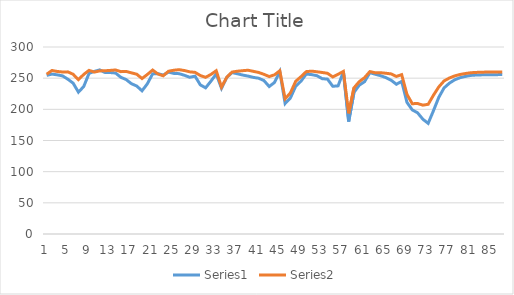
| Category | Series 0 | Series 1 |
|---|---|---|
| 0 | 254.388 | 256.287 |
| 1 | 256.547 | 262.354 |
| 2 | 255.305 | 260.738 |
| 3 | 253.683 | 259.913 |
| 4 | 248.319 | 260.099 |
| 5 | 241.928 | 256.27 |
| 6 | 227.558 | 247.604 |
| 7 | 236.64 | 256.04 |
| 8 | 257.634 | 262.539 |
| 9 | 260.844 | 259.73 |
| 10 | 263.26 | 261.628 |
| 11 | 259.128 | 261.927 |
| 12 | 259.004 | 262.435 |
| 13 | 258.248 | 263.155 |
| 14 | 251.378 | 260.464 |
| 15 | 247.765 | 260.831 |
| 16 | 241.14 | 258.521 |
| 17 | 237.375 | 256.343 |
| 18 | 229.687 | 249.419 |
| 19 | 240.945 | 255.92 |
| 20 | 256.891 | 263.012 |
| 21 | 257.277 | 256.726 |
| 22 | 254.955 | 253.867 |
| 23 | 259.754 | 261.113 |
| 24 | 257.632 | 262.733 |
| 25 | 257.225 | 263.6 |
| 26 | 254.613 | 262.261 |
| 27 | 251.411 | 260.141 |
| 28 | 253.24 | 259.314 |
| 29 | 239.235 | 254.239 |
| 30 | 234.497 | 251.342 |
| 31 | 245.112 | 255.95 |
| 32 | 256.762 | 261.92 |
| 33 | 233.683 | 235.691 |
| 34 | 251.334 | 251.511 |
| 35 | 258.934 | 259.831 |
| 36 | 257.062 | 261.124 |
| 37 | 254.99 | 262.026 |
| 38 | 253.36 | 262.726 |
| 39 | 251.278 | 260.961 |
| 40 | 249.918 | 259.19 |
| 41 | 246.213 | 256.174 |
| 42 | 236.586 | 252.598 |
| 43 | 243.113 | 255.331 |
| 44 | 260.639 | 261.904 |
| 45 | 209.31 | 216.856 |
| 46 | 218.199 | 226.313 |
| 47 | 237.016 | 244.961 |
| 48 | 245.211 | 252.444 |
| 49 | 256.589 | 260.51 |
| 50 | 255.709 | 261.273 |
| 51 | 253.996 | 260.246 |
| 52 | 249.204 | 259.131 |
| 53 | 248.473 | 257.819 |
| 54 | 236.977 | 251.976 |
| 55 | 237.661 | 256.253 |
| 56 | 260.348 | 260.85 |
| 57 | 180.469 | 193.574 |
| 58 | 227.171 | 234.511 |
| 59 | 238.766 | 244.486 |
| 60 | 244.449 | 250.885 |
| 61 | 258.777 | 260.61 |
| 62 | 256.328 | 258.622 |
| 63 | 253.971 | 258.774 |
| 64 | 251.003 | 257.901 |
| 65 | 246.776 | 256.836 |
| 66 | 240.244 | 252.769 |
| 67 | 244.823 | 255.598 |
| 68 | 211.178 | 223.919 |
| 69 | 199.111 | 209.038 |
| 70 | 194.433 | 209.369 |
| 71 | 184.12 | 206.7 |
| 72 | 177.5 | 208.059 |
| 73 | 197.835 | 222.668 |
| 74 | 219.139 | 235.914 |
| 75 | 234.352 | 245.586 |
| 76 | 241.925 | 250.197 |
| 77 | 247.382 | 253.6 |
| 78 | 250.688 | 255.899 |
| 79 | 252.795 | 257.406 |
| 80 | 254.382 | 258.678 |
| 81 | 254.967 | 259.242 |
| 82 | 255.262 | 259.457 |
| 83 | 255.583 | 259.854 |
| 84 | 255.603 | 259.907 |
| 85 | 255.668 | 259.968 |
| 86 | 255.738 | 259.959 |